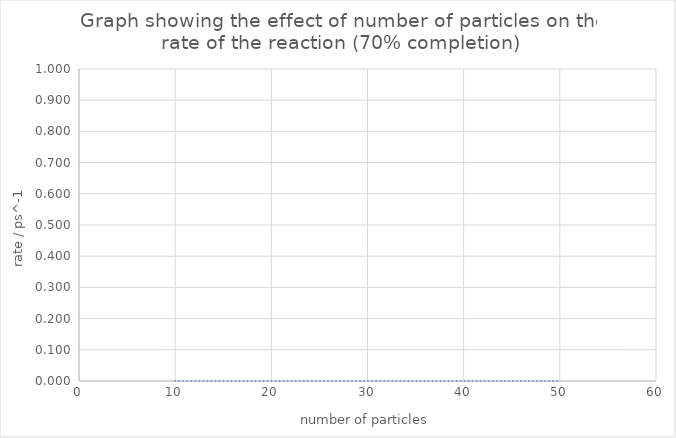
| Category | rate = 1/time (ps⁻¹) |
|---|---|
| 10.0 | 0 |
| 20.0 | 0 |
| 30.0 | 0 |
| 40.0 | 0 |
| 50.0 | 0 |